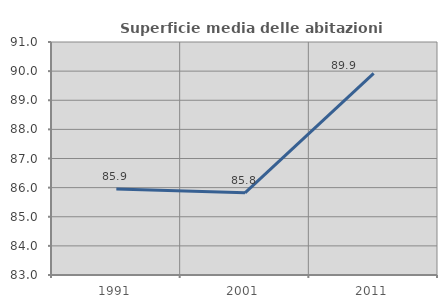
| Category | Superficie media delle abitazioni occupate |
|---|---|
| 1991.0 | 85.949 |
| 2001.0 | 85.821 |
| 2011.0 | 89.926 |